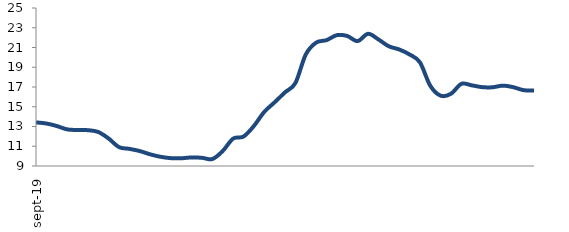
| Category | Series 0 |
|---|---|
| 2019-09-01 | 13.417 |
| 2019-10-01 | 13.304 |
| 2019-11-01 | 13.05 |
| 2019-12-01 | 12.71 |
| 2020-01-01 | 12.642 |
| 2020-02-01 | 12.627 |
| 2020-03-01 | 12.445 |
| 2020-04-01 | 11.784 |
| 2020-05-01 | 10.914 |
| 2020-06-01 | 10.736 |
| 2020-07-01 | 10.514 |
| 2020-08-01 | 10.182 |
| 2020-09-01 | 9.933 |
| 2020-10-01 | 9.795 |
| 2020-11-01 | 9.783 |
| 2020-12-01 | 9.869 |
| 2021-01-01 | 9.83 |
| 2021-02-01 | 9.703 |
| 2021-03-01 | 10.521 |
| 2021-04-01 | 11.773 |
| 2021-05-01 | 11.98 |
| 2021-06-01 | 13.052 |
| 2021-07-01 | 14.478 |
| 2021-08-01 | 15.452 |
| 2021-09-01 | 16.459 |
| 2021-10-01 | 17.401 |
| 2021-11-01 | 20.289 |
| 2021-12-01 | 21.495 |
| 2022-01-01 | 21.744 |
| 2022-02-01 | 22.249 |
| 2022-03-01 | 22.164 |
| 2022-04-01 | 21.65 |
| 2022-05-01 | 22.386 |
| 2022-06-01 | 21.821 |
| 2022-07-01 | 21.126 |
| 2022-08-01 | 20.803 |
| 2022-09-01 | 20.298 |
| 2022-10-01 | 19.505 |
| 2022-11-01 | 17.131 |
| 2022-12-01 | 16.123 |
| 2023-01-01 | 16.316 |
| 2023-02-01 | 17.317 |
| 2023-03-01 | 17.168 |
| 2023-04-01 | 16.986 |
| 2023-05-01 | 16.972 |
| 2023-06-01 | 17.138 |
| 2023-07-01 | 16.98 |
| 2023-08-01 | 16.677 |
| 2023-09-01 | 16.633 |